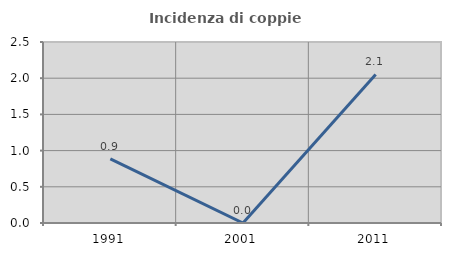
| Category | Incidenza di coppie miste |
|---|---|
| 1991.0 | 0.885 |
| 2001.0 | 0 |
| 2011.0 | 2.051 |